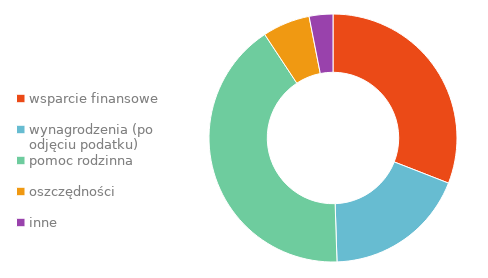
| Category | Series 0 |
|---|---|
| wsparcie finansowe | 0.309 |
| wynagrodzenia (po odjęciu podatku) | 0.186 |
| pomoc rodzinna | 0.412 |
| oszczędności | 0.062 |
| inne | 0.031 |